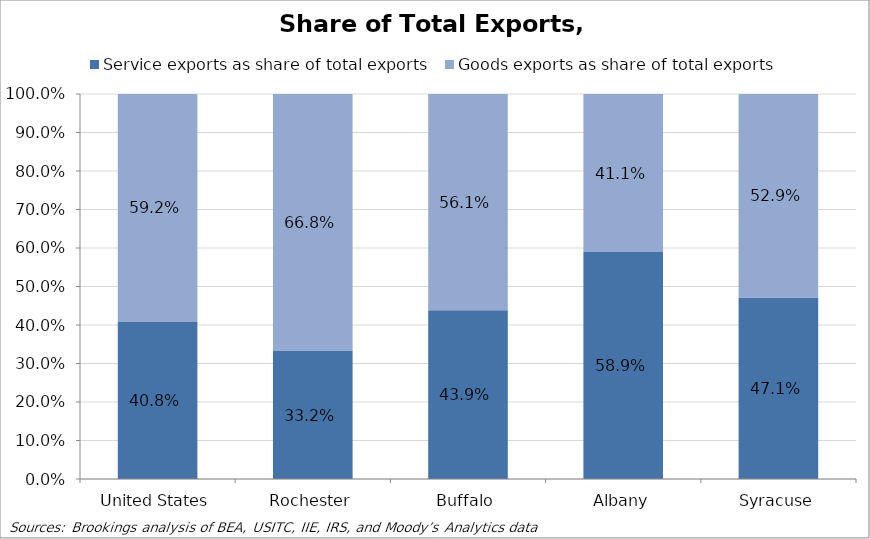
| Category | Service exports as share of total exports | Goods exports as share of total exports |
|---|---|---|
| United States | 0.408 | 0.592 |
| Rochester | 0.332 | 0.668 |
| Buffalo | 0.439 | 0.561 |
| Albany | 0.589 | 0.411 |
| Syracuse | 0.471 | 0.529 |